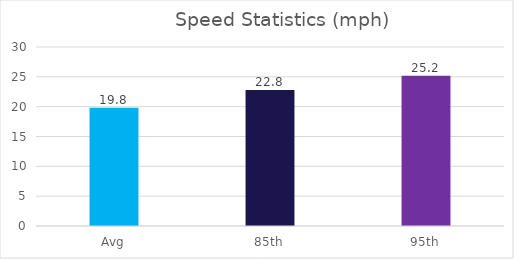
| Category | Series 0 |
|---|---|
| Avg | 19.8 |
| 85th | 22.8 |
| 95th | 25.2 |